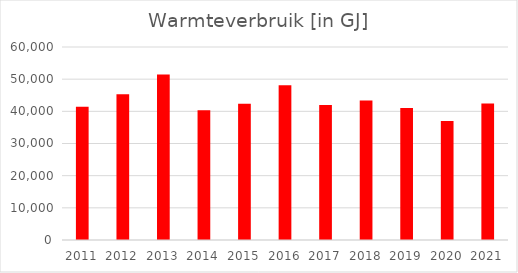
| Category | Warmte  |
|---|---|
| 2011.0 | 41424 |
| 2012.0 | 45288 |
| 2013.0 | 51417 |
| 2014.0 | 40374 |
| 2015.0 | 42330 |
| 2016.0 | 48134 |
| 2017.0 | 42001 |
| 2018.0 | 43336.54 |
| 2019.0 | 41031 |
| 2020.0 | 36987 |
| 2021.0 | 42419 |